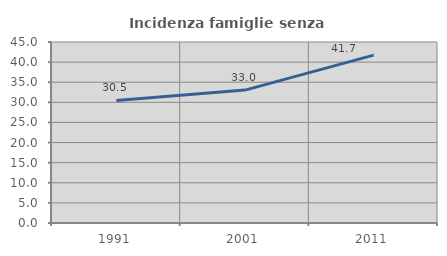
| Category | Incidenza famiglie senza nuclei |
|---|---|
| 1991.0 | 30.472 |
| 2001.0 | 33.043 |
| 2011.0 | 41.739 |